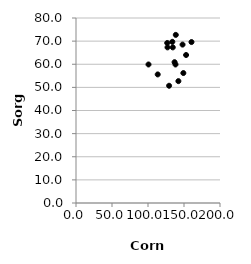
| Category | Series 0 |
|---|---|
| 100.7 | 59.9 |
| 138.6 | 72.7 |
| 113.5 | 55.6 |
| 127.1 | 67.3 |
| 126.7 | 69.2 |
| 134.4 | 67.3 |
| 133.8 | 69.7 |
| 136.9 | 60.9 |
| 138.2 | 59.9 |
| 129.3 | 50.7 |
| 142.2 | 52.7 |
| 160.4 | 69.6 |
| 148.0 | 68.5 |
| 149.1 | 56.2 |
| 152.9 | 64 |